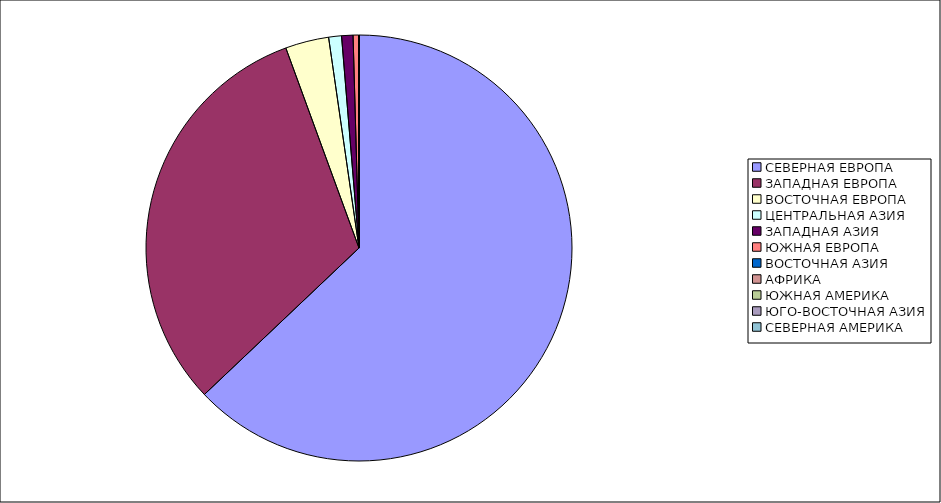
| Category | Оборот |
|---|---|
| СЕВЕРНАЯ ЕВРОПА | 62.928 |
| ЗАПАДНАЯ ЕВРОПА | 31.49 |
| ВОСТОЧНАЯ ЕВРОПА | 3.299 |
| ЦЕНТРАЛЬНАЯ АЗИЯ | 0.974 |
| ЗАПАДНАЯ АЗИЯ | 0.865 |
| ЮЖНАЯ ЕВРОПА | 0.42 |
| ВОСТОЧНАЯ АЗИЯ | 0.011 |
| АФРИКА | 0.01 |
| ЮЖНАЯ АМЕРИКА | 0.003 |
| ЮГО-ВОСТОЧНАЯ АЗИЯ | 0.001 |
| СЕВЕРНАЯ АМЕРИКА | 0 |